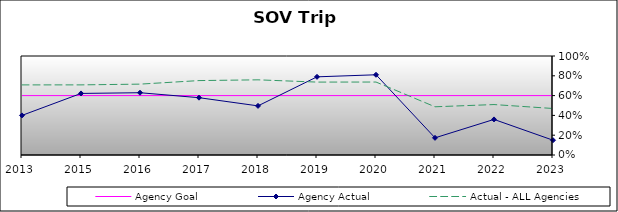
| Category | Agency Goal | Agency Actual | Actual - ALL Agencies |
|---|---|---|---|
| 2013.0 | 0.6 | 0.4 | 0.708 |
| 2015.0 | 0.6 | 0.622 | 0.708 |
| 2016.0 | 0.6 | 0.629 | 0.716 |
| 2017.0 | 0.6 | 0.579 | 0.752 |
| 2018.0 | 0.6 | 0.496 | 0.759 |
| 2019.0 | 0.6 | 0.79 | 0.736 |
| 2020.0 | 0.6 | 0.81 | 0.737 |
| 2021.0 | 0.6 | 0.173 | 0.487 |
| 2022.0 | 0.6 | 0.359 | 0.509 |
| 2023.0 | 0.6 | 0.149 | 0.47 |